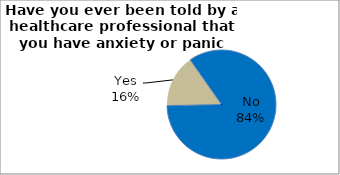
| Category | Series 0 |
|---|---|
| No | 84.369 |
| Yes | 15.631 |